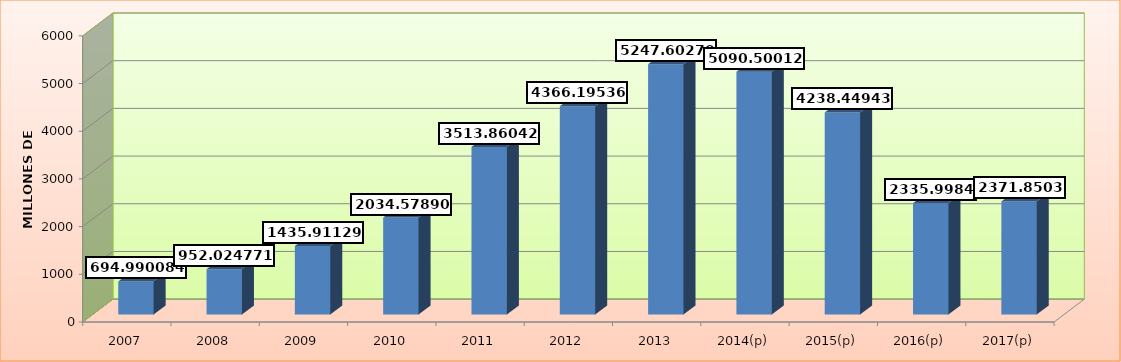
| Category |  US $ |
|---|---|
| 2007 | 694.99 |
| 2008 | 952.025 |
| 2009 | 1435.911 |
| 2010 | 2034.579 |
| 2011 | 3513.86 |
| 2012 | 4366.195 |
| 2013 | 5247.603 |
| 2014(p) | 5090.5 |
| 2015(p) | 4238.449 |
| 2016(p) | 2335.998 |
| 2017(p) | 2371.85 |